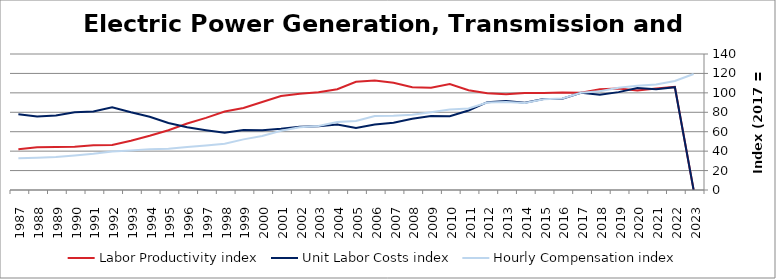
| Category | Labor Productivity index | Unit Labor Costs index | Hourly Compensation index |
|---|---|---|---|
| 2023.0 | 0 | 0 | 119.47 |
| 2022.0 | 106.11 | 105.828 | 112.295 |
| 2021.0 | 104.607 | 103.842 | 108.626 |
| 2020.0 | 102.424 | 104.888 | 107.43 |
| 2019.0 | 104.512 | 100.746 | 105.292 |
| 2018.0 | 103.697 | 97.947 | 101.568 |
| 2017.0 | 100 | 100 | 100 |
| 2016.0 | 100.347 | 93.957 | 94.283 |
| 2015.0 | 99.921 | 93.558 | 93.483 |
| 2014.0 | 99.73 | 89.848 | 89.605 |
| 2013.0 | 98.694 | 91.742 | 90.544 |
| 2012.0 | 99.688 | 90.378 | 90.096 |
| 2011.0 | 102.691 | 81.814 | 84.016 |
| 2010.0 | 109.108 | 76.013 | 82.936 |
| 2009.0 | 105.241 | 76.106 | 80.094 |
| 2008.0 | 105.871 | 73.267 | 77.569 |
| 2007.0 | 110.443 | 69.26 | 76.493 |
| 2006.0 | 112.808 | 67.514 | 76.161 |
| 2005.0 | 111.325 | 63.882 | 71.116 |
| 2004.0 | 103.752 | 67.38 | 69.908 |
| 2003.0 | 100.528 | 65.518 | 65.864 |
| 2002.0 | 99.079 | 65.19 | 64.59 |
| 2001.0 | 96.744 | 63.091 | 61.037 |
| 2000.0 | 90.601 | 61.437 | 55.662 |
| 1999.0 | 84.375 | 61.774 | 52.122 |
| 1998.0 | 80.854 | 58.851 | 47.584 |
| 1997.0 | 74.265 | 61.596 | 45.744 |
| 1996.0 | 68.513 | 64.661 | 44.301 |
| 1995.0 | 61.576 | 68.915 | 42.435 |
| 1994.0 | 55.789 | 75.418 | 42.075 |
| 1993.0 | 50.798 | 80.041 | 40.659 |
| 1992.0 | 46.4 | 85.259 | 39.56 |
| 1991.0 | 46.063 | 80.84 | 37.237 |
| 1990.0 | 44.436 | 79.956 | 35.529 |
| 1989.0 | 44.325 | 76.582 | 33.945 |
| 1988.0 | 43.95 | 75.723 | 33.281 |
| 1987.0 | 41.835 | 78.039 | 32.647 |